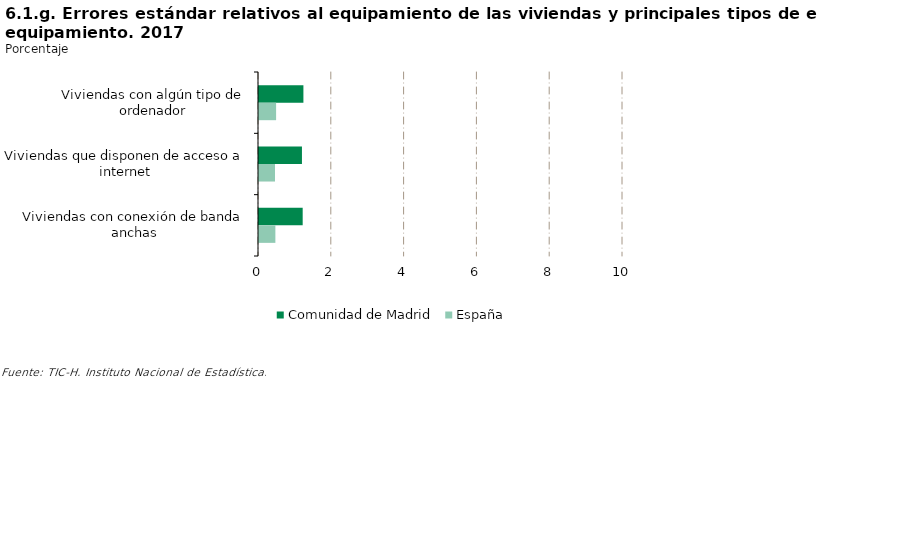
| Category | Comunidad de Madrid | España |
|---|---|---|
| Viviendas con algún tipo de ordenador | 1.22 | 0.47 |
| Viviendas que disponen de acceso a internet | 1.18 | 0.44 |
| Viviendas con conexión de banda anchas | 1.2 | 0.45 |